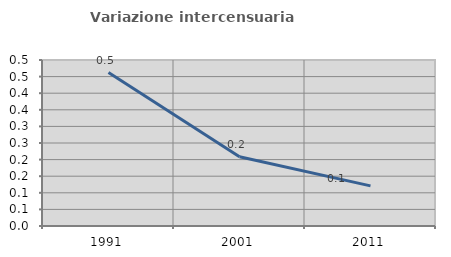
| Category | Variazione intercensuaria annua |
|---|---|
| 1991.0 | 0.462 |
| 2001.0 | 0.208 |
| 2011.0 | 0.121 |